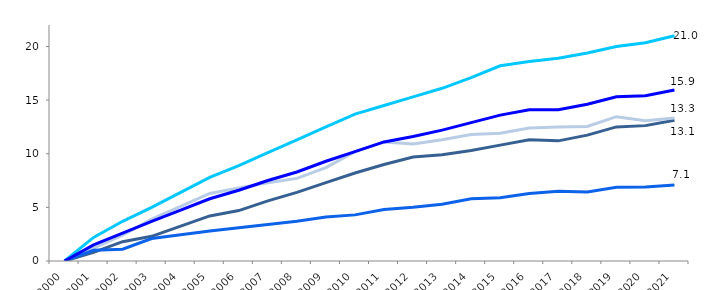
| Category | Collèges | LEGT | LP | Cités scolaires | Ensemble |
|---|---|---|---|---|---|
| 2000.0 | 0 | 0 | 0 | 0 | 0 |
| 2001.0 | 2.2 | 0.8 | 1.2 | 1 | 1.5 |
| 2002.0 | 3.7 | 1.8 | 2.4 | 1.1 | 2.6 |
| 2003.0 | 5 | 2.3 | 3.9 | 2.1 | 3.7 |
| 2004.0 | 6.4 | 3.25 | 5.1 | 2.45 | 4.75 |
| 2005.0 | 7.8 | 4.2 | 6.3 | 2.8 | 5.8 |
| 2006.0 | 8.9 | 4.7 | 6.8 | 3.1 | 6.6 |
| 2007.0 | 10.1 | 5.6 | 7.3 | 3.4 | 7.5 |
| 2008.0 | 11.3 | 6.4 | 7.7 | 3.7 | 8.3 |
| 2009.0 | 12.5 | 7.3 | 8.7 | 4.1 | 9.3 |
| 2010.0 | 13.7 | 8.2 | 10.2 | 4.3 | 10.2 |
| 2011.0 | 14.5 | 9 | 11.1 | 4.8 | 11.1 |
| 2012.0 | 15.3 | 9.7 | 10.9 | 5 | 11.6 |
| 2013.0 | 16.1 | 9.9 | 11.3 | 5.3 | 12.2 |
| 2014.0 | 17.1 | 10.3 | 11.8 | 5.8 | 12.9 |
| 2015.0 | 18.2 | 10.8 | 11.9 | 5.9 | 13.6 |
| 2016.0 | 18.6 | 11.3 | 12.4 | 6.3 | 14.1 |
| 2017.0 | 18.9 | 11.2 | 12.5 | 6.5 | 14.1 |
| 2018.0 | 19.389 | 11.736 | 12.534 | 6.441 | 14.616 |
| 2019.0 | 19.994 | 12.501 | 13.455 | 6.864 | 15.317 |
| 2020.0 | 20.347 | 12.62 | 13.084 | 6.895 | 15.412 |
| 2021.0 | 20.993 | 13.125 | 13.33 | 7.077 | 15.941 |